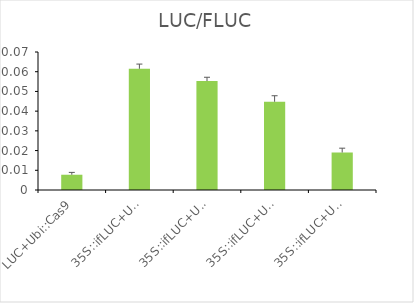
| Category | LUC/FLUC |
|---|---|
| LUC+Ubi::Cas9 | 0.008 |
| 35S::ifLUC+Ubi::Cas9 | 0.061 |
| 35S::ifLUC+Ubi::Cas9+OsU6a::sgRNA | 0.055 |
| 35S::ifLUC+Ubi::Cas9+MaU6c::sgRNA | 0.045 |
| 35S::ifLUC+Ubi::opCas9+MaU6c::sgRNA | 0.019 |